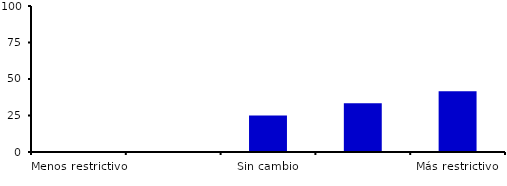
| Category | Series 0 |
|---|---|
| Menos restrictivo | 0 |
| Moderadamente menos restrictivo | 0 |
| Sin cambio | 25 |
| Moderadamente más restrictivo | 33.333 |
| Más restrictivo | 41.667 |